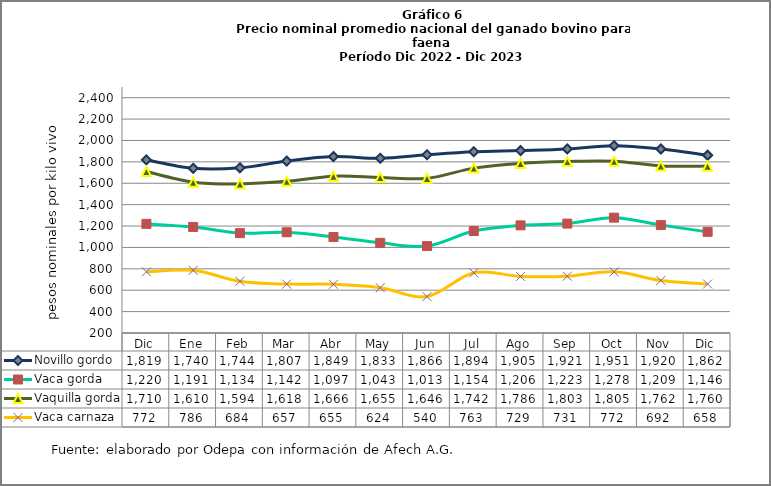
| Category | Novillo gordo | Vaca gorda | Vaquilla gorda | Vaca carnaza |
|---|---|---|---|---|
| Dic | 1818.974 | 1220.441 | 1709.913 | 772.154 |
| Ene | 1739.977 | 1191.358 | 1609.585 | 786.065 |
| Feb | 1744.212 | 1133.956 | 1593.593 | 684.001 |
| Mar | 1807.14 | 1141.797 | 1617.763 | 657.049 |
| Abr | 1849.073 | 1097.309 | 1666.465 | 655.338 |
| May | 1833.244 | 1043.064 | 1655.004 | 623.873 |
| Jun | 1866.208 | 1012.93 | 1645.542 | 540.46 |
| Jul | 1893.969 | 1153.525 | 1741.587 | 762.807 |
| Ago | 1905.484 | 1206.302 | 1785.511 | 729.045 |
| Sep | 1920.648 | 1222.864 | 1802.7 | 730.851 |
| Oct | 1951.491 | 1278.473 | 1805.377 | 771.617 |
| Nov | 1920.352 | 1209.264 | 1762.414 | 691.678 |
| Dic | 1861.642 | 1145.505 | 1760.212 | 657.854 |